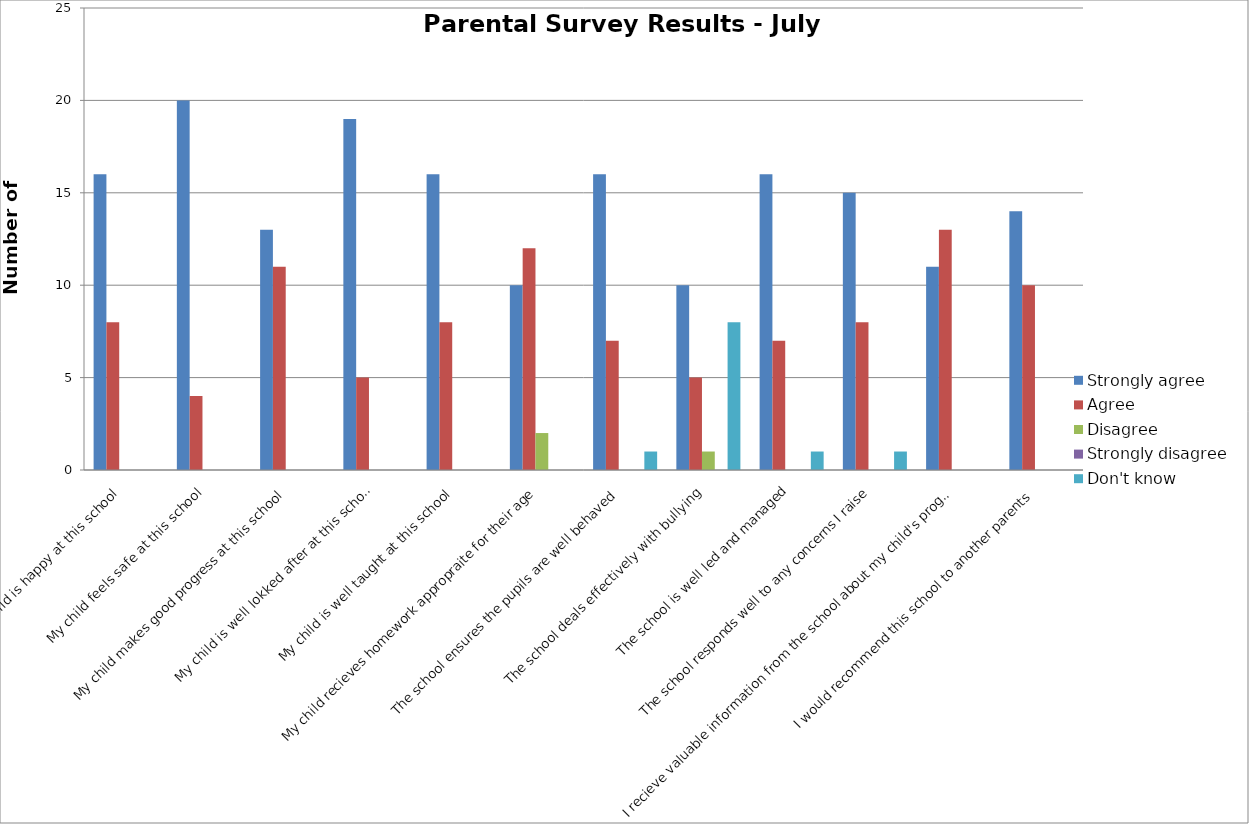
| Category | Strongly agree | Agree | Disagree | Strongly disagree | Don't know |
|---|---|---|---|---|---|
| My child is happy at this school | 16 | 8 | 0 | 0 | 0 |
| My child feels safe at this school | 20 | 4 | 0 | 0 | 0 |
| My child makes good progress at this school | 13 | 11 | 0 | 0 | 0 |
| My child is well lokked after at this school | 19 | 5 | 0 | 0 | 0 |
| My child is well taught at this school | 16 | 8 | 0 | 0 | 0 |
| My child recieves homework appropraite for their age | 10 | 12 | 2 | 0 | 0 |
| The school ensures the pupils are well behaved | 16 | 7 | 0 | 0 | 1 |
| The school deals effectively with bullying | 10 | 5 | 1 | 0 | 8 |
| The school is well led and managed | 16 | 7 | 0 | 0 | 1 |
| The school responds well to any concerns I raise | 15 | 8 | 0 | 0 | 1 |
| I recieve valuable information from the school about my child's progress | 11 | 13 | 0 | 0 | 0 |
| I would recommend this school to another parents | 14 | 10 | 0 | 0 | 0 |